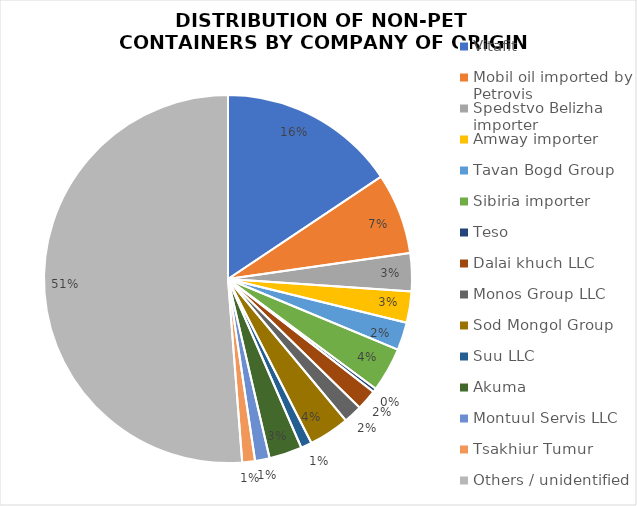
| Category | Series 1 |
|---|---|
| Vitafit | 8.425 |
| Mobil oil imported by Petrovis | 3.84 |
| Spedstvo Belizha importer | 1.8 |
| Amway importer | 1.485 |
| Tavan Bogd Group | 1.32 |
| Sibiria importer | 2.1 |
| Teso | 0.18 |
| Dalai khuch LLC | 0.98 |
| Monos Group LLC | 0.88 |
| Sod Mongol Group | 1.92 |
| Suu LLC | 0.52 |
| Akuma | 1.56 |
| Montuul Servis LLC | 0.69 |
| Tsakhiur Tumur | 0.605 |
| Others / unidentified | 27.635 |